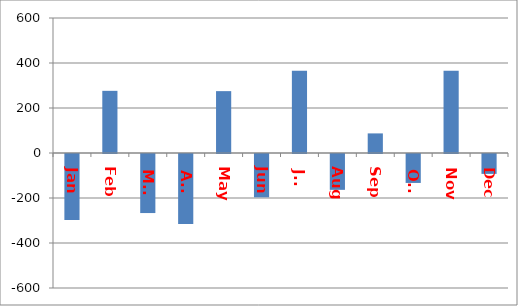
| Category | Information |
|---|---|
| Jan | -293.07 |
| Feb | 276.29 |
| Mar | -262.47 |
| Apr | -311.25 |
| May | 274.97 |
| Jun | -192.51 |
| Jul | 365.94 |
| Aug | -159.31 |
| Sep | 87.1 |
| Oct | -128.63 |
| Nov | 365.8 |
| Dec | -88.37 |